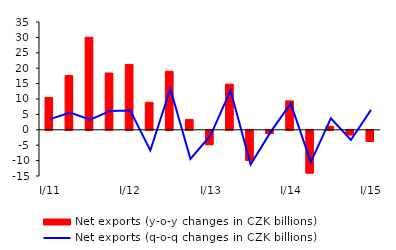
| Category | Net exports (y-o-y changes in CZK billions) |
|---|---|
|  I/11 | 10.496 |
| II | 17.625 |
| III | 30.054 |
| IV | 18.433 |
|  I/12 | 21.224 |
| II | 8.935 |
| III | 19.013 |
| IV | 3.396 |
|  I/13 | -4.663 |
| II | 14.836 |
| III | -9.77 |
| IV | -0.976 |
|  I/14 | 9.403 |
| II | -13.885 |
| III | 1.141 |
| IV | -1.482 |
|  I/15 | -3.578 |